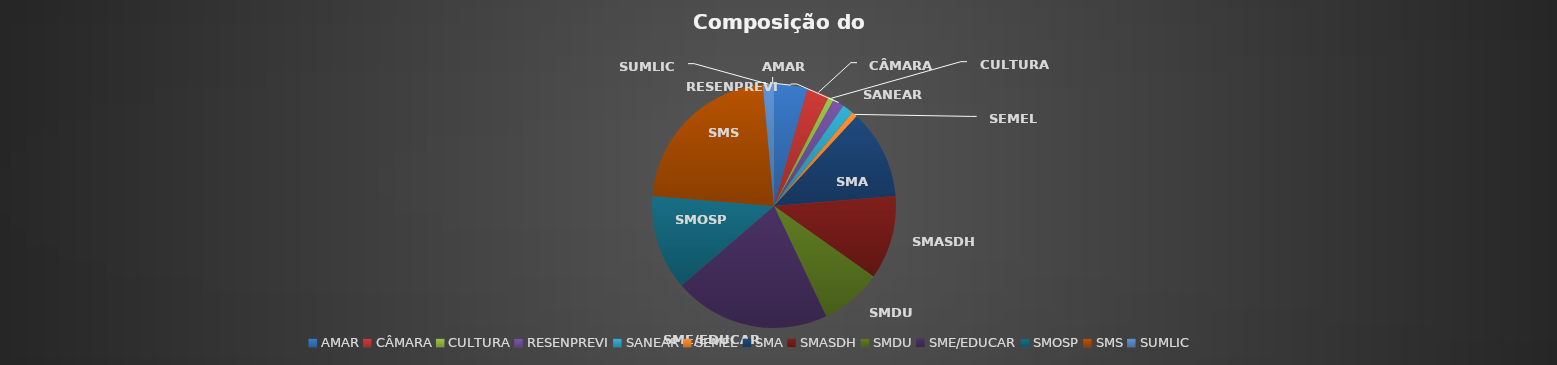
| Category | Total |
|---|---|
| AMAR | 0.044 |
| CÂMARA | 0.03 |
| CULTURA | 0.007 |
| RESENPREVI | 0.015 |
| SANEAR | 0.015 |
| SEMEL | 0.007 |
| SMA | 0.119 |
| SMASDH | 0.111 |
| SMDU | 0.081 |
| SME/EDUCAR | 0.207 |
| SMOSP | 0.126 |
| SMS | 0.222 |
| SUMLIC | 0.015 |